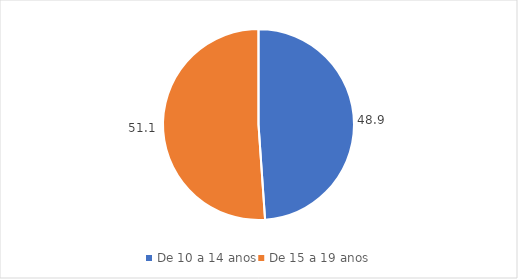
| Category | Series 0 |
|---|---|
| De 10 a 14 anos | 48.9 |
| De 15 a 19 anos | 51.1 |